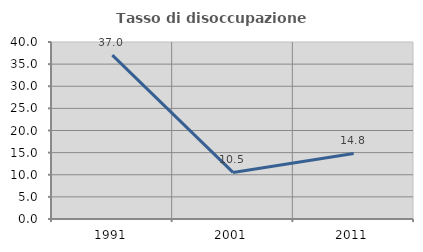
| Category | Tasso di disoccupazione giovanile  |
|---|---|
| 1991.0 | 37.037 |
| 2001.0 | 10.526 |
| 2011.0 | 14.815 |